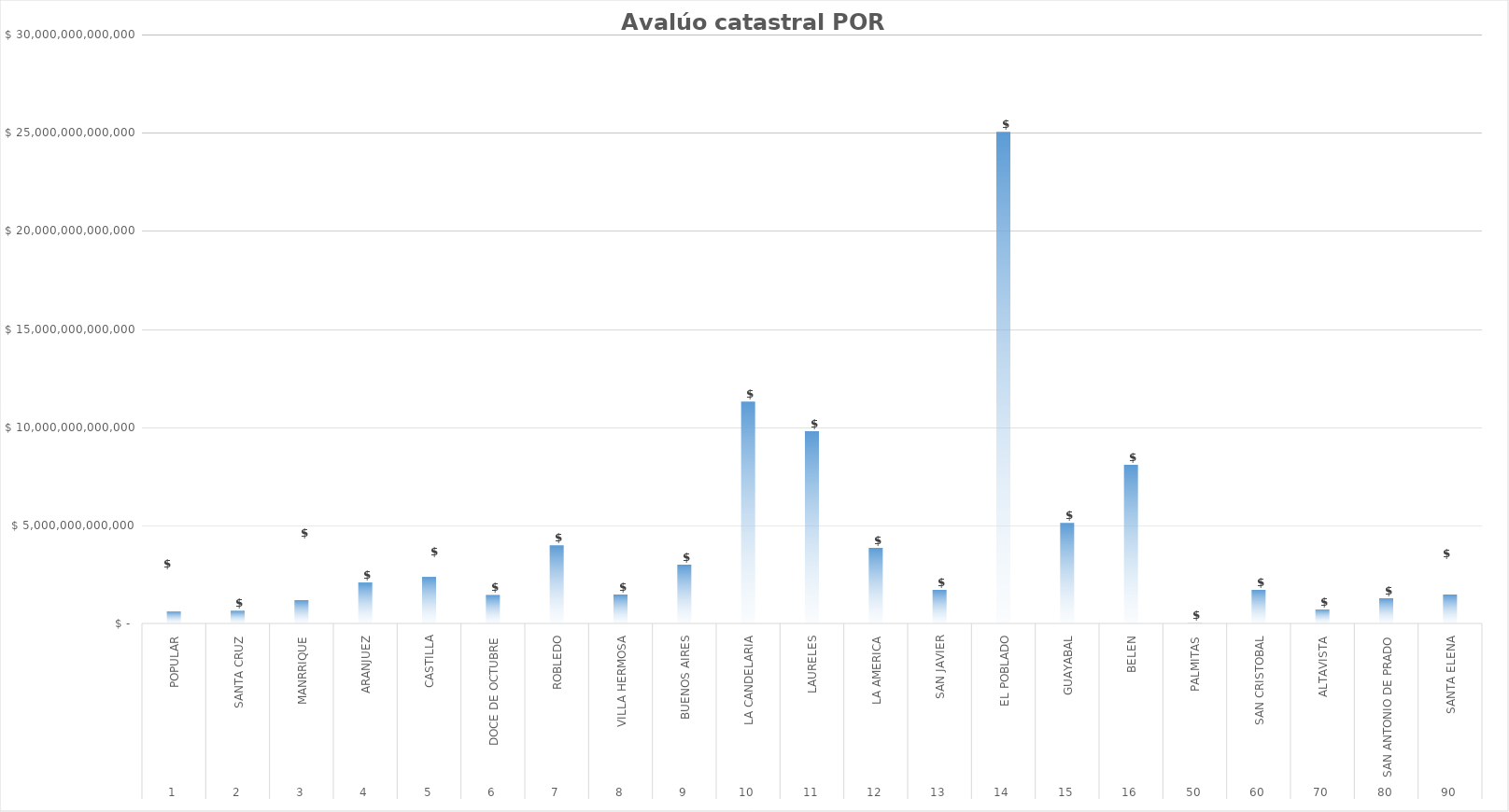
| Category | Avalúo Total |
|---|---|
| 0 | 610999961000 |
| 1 | 649742242000 |
| 2 | 1192122813000 |
| 3 | 2088514240000 |
| 4 | 2374426732000 |
| 5 | 1454358947000 |
| 6 | 3977525535000 |
| 7 | 1484195731000 |
| 8 | 3012492299000 |
| 9 | 11303155636000 |
| 10 | 9797393003600 |
| 11 | 3868856142520 |
| 12 | 1720615515000 |
| 13 | 25041019588000 |
| 14 | 5118049179200 |
| 15 | 8080796707000 |
| 16 | 65296278473 |
| 17 | 1725710605166 |
| 18 | 736585589000 |
| 19 | 1290824584000 |
| 20 | 1480199078880 |